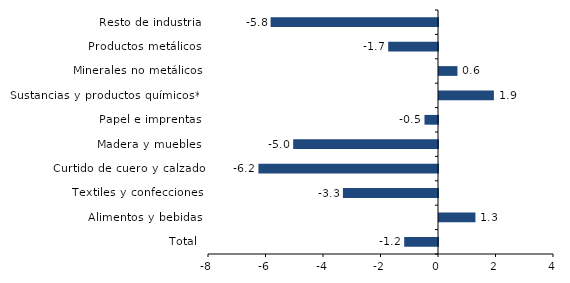
| Category | Series 0 |
|---|---|
| Total | -1.176 |
| Alimentos y bebidas | 1.267 |
| Textiles y confecciones | -3.308 |
| Curtido de cuero y calzado | -6.246 |
| Madera y muebles | -5.037 |
| Papel e imprentas | -0.47 |
| Sustancias y productos químicos** | 1.909 |
| Minerales no metálicos | 0.642 |
| Productos metálicos | -1.732 |
| Resto de industria | -5.823 |